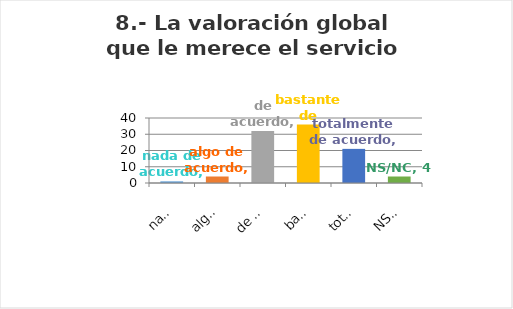
| Category | Series 0 |
|---|---|
| nada de acuerdo | 1 |
| algo de acuerdo | 4 |
| de acuerdo | 32 |
| bastante de acuerdo | 36 |
| totalmente de acuerdo | 21 |
| NS/NC | 4 |